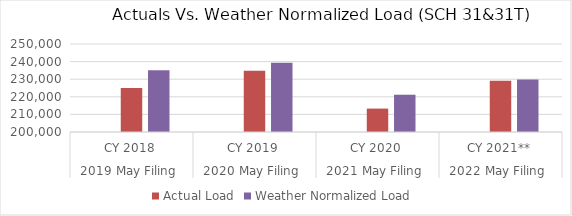
| Category | Residential: SCH 23&53 | Actual Load | Weather Normalized Load  |
|---|---|---|---|
| 0 |  | 225064.26 | 235132.261 |
| 1 |  | 234795.377 | 239284.499 |
| 2 |  | 213302.726 | 221175.079 |
| 3 |  | 229180.561 | 229889.877 |